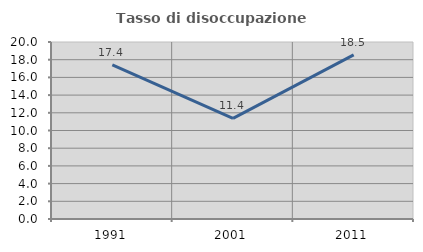
| Category | Tasso di disoccupazione giovanile  |
|---|---|
| 1991.0 | 17.417 |
| 2001.0 | 11.371 |
| 2011.0 | 18.548 |